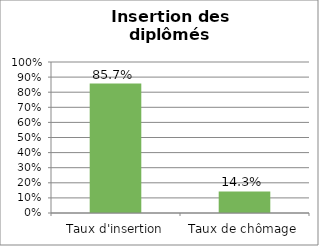
| Category | Promotion 2007 |
|---|---|
| Taux d'insertion | 0.857 |
| Taux de chômage | 0.143 |